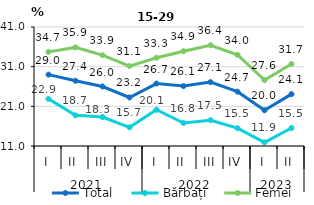
| Category | Total | Bărbați | Femei |
|---|---|---|---|
| 0 | 28.999 | 22.886 | 34.731 |
| 1 | 27.448 | 18.722 | 35.856 |
| 2 | 26 | 18.3 | 33.9 |
| 3 | 23.232 | 15.71 | 31.142 |
| 4 | 26.744 | 20.142 | 33.259 |
| 5 | 26.1 | 16.8 | 34.9 |
| 6 | 27.1 | 17.5 | 36.4 |
| 7 | 24.7 | 15.5 | 34 |
| 8 | 20 | 11.9 | 27.6 |
| 9 | 24.074 | 15.537 | 31.654 |